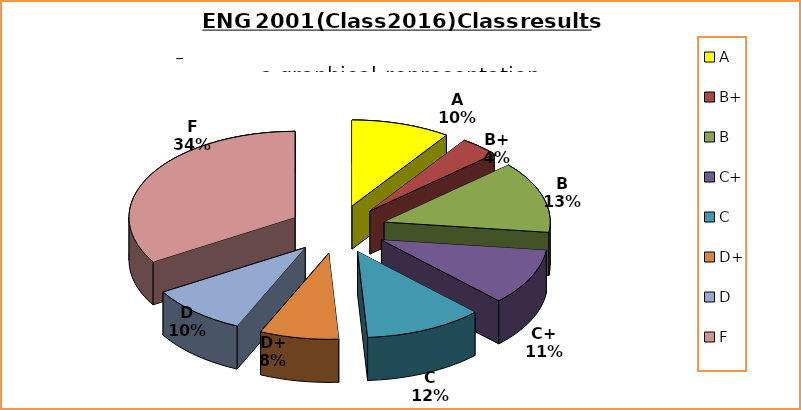
| Category | Series 0 |
|---|---|
| A | 10 |
| B+ | 4 |
| B | 14 |
| C+ | 11 |
| C | 12 |
| D+ | 8 |
| D | 10 |
| F | 35 |